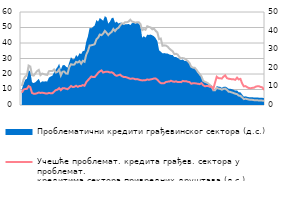
| Category | Учешће проблемат. кредита грађев. сектора у укупним
кредитима грађев. сектора (л.с.) | Учешће проблемат. кредита грађев. сектора у проблемат. 
кредитима сектора привредних друштава (л.с.) |
|---|---|---|
|  | 12.298 | 7.953 |
|  | 16.411 | 9.964 |
|  | 18.367 | 10.307 |
|  | 19.169 | 10.429 |
| 6
2009. | 25.433 | 12.171 |
|  | 24.835 | 11.492 |
|  | 19.256 | 7.802 |
|  | 18.981 | 7.244 |
|  | 20.435 | 7.307 |
|  | 21.895 | 7.598 |
| 12 | 22.645 | 8.082 |
| 1
2010. | 19.291 | 7.791 |
|  | 20.325 | 7.901 |
|  | 19.909 | 7.77 |
|  | 19.587 | 7.459 |
|  | 19.384 | 7.403 |
| 6
2010. | 21.841 | 7.803 |
|  | 21.9 | 7.569 |
|  | 21.893 | 7.585 |
|  | 22.897 | 8.602 |
|  | 20.957 | 9.578 |
|  | 21.316 | 9.883 |
| 12 | 22.951 | 10.902 |
| 1
2011. | 19.044 | 9.605 |
|  | 21.464 | 10.773 |
|  | 21.647 | 10.817 |
|  | 20.33 | 10.537 |
|  | 20.222 | 10.213 |
| 6
2011. | 24.486 | 11.167 |
|  | 26.307 | 12.286 |
|  | 26.025 | 11.63 |
|  | 26.069 | 11.734 |
|  | 27.804 | 12.439 |
|  | 27.388 | 11.715 |
| 12 | 28.322 | 12.235 |
| 1
2012. | 26.666 | 12.303 |
|  | 28.495 | 12.822 |
|  | 27.903 | 12.414 |
|  | 32.444 | 14.729 |
|  | 34.841 | 15.967 |
| 6
2012. | 38.393 | 17.166 |
|  | 38.504 | 18.425 |
|  | 38.824 | 18.02 |
|  | 39.218 | 18.083 |
|  | 42.401 | 19.329 |
|  | 43.421 | 20.716 |
| 12 | 45.464 | 21.691 |
| 1
2013. | 45.077 | 22.315 |
|  | 46.093 | 20.946 |
|  | 47.827 | 21.339 |
|  | 46.562 | 21.484 |
|  | 45.129 | 21.378 |
| 6
2013. | 46.309 | 20.985 |
|  | 47.078 | 21.124 |
|  | 49.061 | 20.535 |
|  | 47.719 | 19.305 |
|  | 49.11 | 18.858 |
|  | 49.753 | 19.235 |
| 12 | 51.351 | 19.613 |
| 1
2014. | 52.672 | 18.623 |
|  | 52.459 | 18.13 |
|  | 53.449 | 18.092 |
|  | 53.4 | 17.773 |
|  | 53.814 | 17.325 |
| 6
2014. | 55.031 | 16.909 |
|  | 53.856 | 17.062 |
|  | 53.532 | 17.007 |
|  | 53.153 | 16.589 |
|  | 53.392 | 16.713 |
|  | 53.438 | 16.409 |
| 12 | 52.2 | 16.064 |
| 1
2015. | 48.26 | 15.867 |
|  | 48.994 | 15.97 |
|  | 48.54 | 16.023 |
|  | 50.819 | 16.5 |
|  | 50.398 | 16.224 |
| 6
2015. | 50.034 | 16.529 |
|  | 48.852 | 16.755 |
|  | 49.2 | 17.08 |
|  | 47.851 | 17.074 |
|  | 46.8 | 16.302 |
|  | 42.497 | 15.02 |
| 12 | 42.897 | 14.115 |
| 1
2016. | 38.217 | 14.005 |
|  | 38.481 | 14.086 |
|  | 38.357 | 14.828 |
|  | 37.683 | 15.073 |
|  | 36.469 | 15.098 |
| 6
2016. | 35.485 | 15.671 |
|  | 34.686 | 15.189 |
|  | 32.812 | 15.006 |
|  | 33.031 | 15.257 |
|  | 32.472 | 14.824 |
|  | 30.854 | 14.772 |
| 12 | 30.237 | 14.756 |
| 1
2017. | 30.25 | 15.536 |
|  | 30.017 | 15.275 |
|  | 29.166 | 15.356 |
|  | 28.279 | 14.979 |
|  | 26.947 | 14.796 |
| 6
2017. | 24.631 | 13.709 |
|  | 24.106 | 14.046 |
|  | 24.082 | 14.052 |
|  | 22.783 | 13.837 |
|  | 21.226 | 13.72 |
|  | 19.97 | 13.447 |
| 12 | 18.452 | 14.114 |
| 1
2018. | 15.625 | 12.822 |
|  | 14.94 | 12.128 |
|  | 14.54 | 12.227 |
|  | 13.92 | 12.239 |
|  | 12.85 | 11.727 |
| 6
2018. | 11.9 | 11.834 |
|  | 9.5 | 10.392 |
|  | 9.47 | 14.361 |
|  | 11.06 | 18.232 |
|  | 10.59 | 17.345 |
|  | 10.44 | 17.269 |
| 12 | 9.88 | 17.028 |
| 1
2019. | 10.41 | 18.313 |
|  | 10.579 | 19.133 |
|  | 9.755 | 17.365 |
|  | 8.609 | 16.93 |
|  | 8.463 | 16.813 |
| 6
2019. | 8.06 | 16.583 |
|  | 7.693 | 16.56 |
|  | 7.264 | 16.26 |
|  | 7.001 | 17.614 |
|  | 6.068 | 16.511 |
|  | 5.909 | 16.838 |
| 12 | 4.879 | 13.922 |
| 1
2020. | 3.783 | 12.044 |
|  | 4.026 | 12.199 |
|  | 3.781 | 11.477 |
|  | 3.49 | 10.947 |
|  | 3.39 | 10.794 |
| 6
2020. | 3.325 | 11.042 |
|  | 3.14 | 11.152 |
|  | 3.091 | 11.832 |
|  | 3.018 | 12.084 |
|  | 2.917 | 12.046 |
|  | 2.859 | 11.635 |
| 12 | 2.814 | 11.33 |